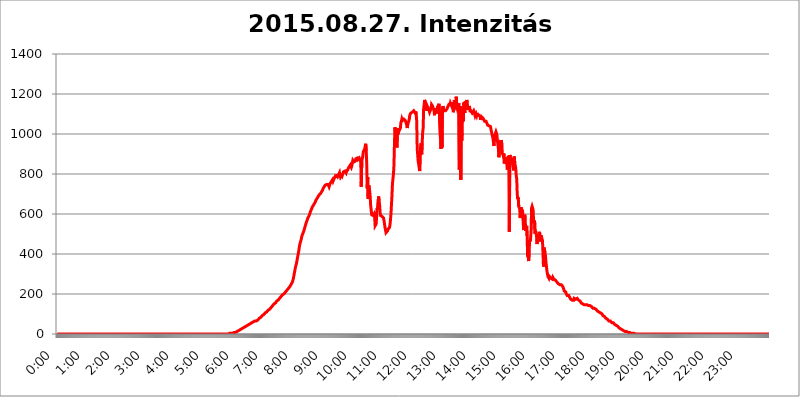
| Category | 2015.08.27. Intenzitás [W/m^2] |
|---|---|
| 0.0 | 0 |
| 0.0006944444444444445 | 0 |
| 0.001388888888888889 | 0 |
| 0.0020833333333333333 | 0 |
| 0.002777777777777778 | 0 |
| 0.003472222222222222 | 0 |
| 0.004166666666666667 | 0 |
| 0.004861111111111111 | 0 |
| 0.005555555555555556 | 0 |
| 0.0062499999999999995 | 0 |
| 0.006944444444444444 | 0 |
| 0.007638888888888889 | 0 |
| 0.008333333333333333 | 0 |
| 0.009027777777777779 | 0 |
| 0.009722222222222222 | 0 |
| 0.010416666666666666 | 0 |
| 0.011111111111111112 | 0 |
| 0.011805555555555555 | 0 |
| 0.012499999999999999 | 0 |
| 0.013194444444444444 | 0 |
| 0.013888888888888888 | 0 |
| 0.014583333333333332 | 0 |
| 0.015277777777777777 | 0 |
| 0.015972222222222224 | 0 |
| 0.016666666666666666 | 0 |
| 0.017361111111111112 | 0 |
| 0.018055555555555557 | 0 |
| 0.01875 | 0 |
| 0.019444444444444445 | 0 |
| 0.02013888888888889 | 0 |
| 0.020833333333333332 | 0 |
| 0.02152777777777778 | 0 |
| 0.022222222222222223 | 0 |
| 0.02291666666666667 | 0 |
| 0.02361111111111111 | 0 |
| 0.024305555555555556 | 0 |
| 0.024999999999999998 | 0 |
| 0.025694444444444447 | 0 |
| 0.02638888888888889 | 0 |
| 0.027083333333333334 | 0 |
| 0.027777777777777776 | 0 |
| 0.02847222222222222 | 0 |
| 0.029166666666666664 | 0 |
| 0.029861111111111113 | 0 |
| 0.030555555555555555 | 0 |
| 0.03125 | 0 |
| 0.03194444444444445 | 0 |
| 0.03263888888888889 | 0 |
| 0.03333333333333333 | 0 |
| 0.034027777777777775 | 0 |
| 0.034722222222222224 | 0 |
| 0.035416666666666666 | 0 |
| 0.036111111111111115 | 0 |
| 0.03680555555555556 | 0 |
| 0.0375 | 0 |
| 0.03819444444444444 | 0 |
| 0.03888888888888889 | 0 |
| 0.03958333333333333 | 0 |
| 0.04027777777777778 | 0 |
| 0.04097222222222222 | 0 |
| 0.041666666666666664 | 0 |
| 0.042361111111111106 | 0 |
| 0.04305555555555556 | 0 |
| 0.043750000000000004 | 0 |
| 0.044444444444444446 | 0 |
| 0.04513888888888889 | 0 |
| 0.04583333333333334 | 0 |
| 0.04652777777777778 | 0 |
| 0.04722222222222222 | 0 |
| 0.04791666666666666 | 0 |
| 0.04861111111111111 | 0 |
| 0.049305555555555554 | 0 |
| 0.049999999999999996 | 0 |
| 0.05069444444444445 | 0 |
| 0.051388888888888894 | 0 |
| 0.052083333333333336 | 0 |
| 0.05277777777777778 | 0 |
| 0.05347222222222222 | 0 |
| 0.05416666666666667 | 0 |
| 0.05486111111111111 | 0 |
| 0.05555555555555555 | 0 |
| 0.05625 | 0 |
| 0.05694444444444444 | 0 |
| 0.057638888888888885 | 0 |
| 0.05833333333333333 | 0 |
| 0.05902777777777778 | 0 |
| 0.059722222222222225 | 0 |
| 0.06041666666666667 | 0 |
| 0.061111111111111116 | 0 |
| 0.06180555555555556 | 0 |
| 0.0625 | 0 |
| 0.06319444444444444 | 0 |
| 0.06388888888888888 | 0 |
| 0.06458333333333334 | 0 |
| 0.06527777777777778 | 0 |
| 0.06597222222222222 | 0 |
| 0.06666666666666667 | 0 |
| 0.06736111111111111 | 0 |
| 0.06805555555555555 | 0 |
| 0.06874999999999999 | 0 |
| 0.06944444444444443 | 0 |
| 0.07013888888888889 | 0 |
| 0.07083333333333333 | 0 |
| 0.07152777777777779 | 0 |
| 0.07222222222222223 | 0 |
| 0.07291666666666667 | 0 |
| 0.07361111111111111 | 0 |
| 0.07430555555555556 | 0 |
| 0.075 | 0 |
| 0.07569444444444444 | 0 |
| 0.0763888888888889 | 0 |
| 0.07708333333333334 | 0 |
| 0.07777777777777778 | 0 |
| 0.07847222222222222 | 0 |
| 0.07916666666666666 | 0 |
| 0.0798611111111111 | 0 |
| 0.08055555555555556 | 0 |
| 0.08125 | 0 |
| 0.08194444444444444 | 0 |
| 0.08263888888888889 | 0 |
| 0.08333333333333333 | 0 |
| 0.08402777777777777 | 0 |
| 0.08472222222222221 | 0 |
| 0.08541666666666665 | 0 |
| 0.08611111111111112 | 0 |
| 0.08680555555555557 | 0 |
| 0.08750000000000001 | 0 |
| 0.08819444444444445 | 0 |
| 0.08888888888888889 | 0 |
| 0.08958333333333333 | 0 |
| 0.09027777777777778 | 0 |
| 0.09097222222222222 | 0 |
| 0.09166666666666667 | 0 |
| 0.09236111111111112 | 0 |
| 0.09305555555555556 | 0 |
| 0.09375 | 0 |
| 0.09444444444444444 | 0 |
| 0.09513888888888888 | 0 |
| 0.09583333333333333 | 0 |
| 0.09652777777777777 | 0 |
| 0.09722222222222222 | 0 |
| 0.09791666666666667 | 0 |
| 0.09861111111111111 | 0 |
| 0.09930555555555555 | 0 |
| 0.09999999999999999 | 0 |
| 0.10069444444444443 | 0 |
| 0.1013888888888889 | 0 |
| 0.10208333333333335 | 0 |
| 0.10277777777777779 | 0 |
| 0.10347222222222223 | 0 |
| 0.10416666666666667 | 0 |
| 0.10486111111111111 | 0 |
| 0.10555555555555556 | 0 |
| 0.10625 | 0 |
| 0.10694444444444444 | 0 |
| 0.1076388888888889 | 0 |
| 0.10833333333333334 | 0 |
| 0.10902777777777778 | 0 |
| 0.10972222222222222 | 0 |
| 0.1111111111111111 | 0 |
| 0.11180555555555556 | 0 |
| 0.11180555555555556 | 0 |
| 0.1125 | 0 |
| 0.11319444444444444 | 0 |
| 0.11388888888888889 | 0 |
| 0.11458333333333333 | 0 |
| 0.11527777777777777 | 0 |
| 0.11597222222222221 | 0 |
| 0.11666666666666665 | 0 |
| 0.1173611111111111 | 0 |
| 0.11805555555555557 | 0 |
| 0.11944444444444445 | 0 |
| 0.12013888888888889 | 0 |
| 0.12083333333333333 | 0 |
| 0.12152777777777778 | 0 |
| 0.12222222222222223 | 0 |
| 0.12291666666666667 | 0 |
| 0.12291666666666667 | 0 |
| 0.12361111111111112 | 0 |
| 0.12430555555555556 | 0 |
| 0.125 | 0 |
| 0.12569444444444444 | 0 |
| 0.12638888888888888 | 0 |
| 0.12708333333333333 | 0 |
| 0.16875 | 0 |
| 0.12847222222222224 | 0 |
| 0.12916666666666668 | 0 |
| 0.12986111111111112 | 0 |
| 0.13055555555555556 | 0 |
| 0.13125 | 0 |
| 0.13194444444444445 | 0 |
| 0.1326388888888889 | 0 |
| 0.13333333333333333 | 0 |
| 0.13402777777777777 | 0 |
| 0.13402777777777777 | 0 |
| 0.13472222222222222 | 0 |
| 0.13541666666666666 | 0 |
| 0.1361111111111111 | 0 |
| 0.13749999999999998 | 0 |
| 0.13819444444444443 | 0 |
| 0.1388888888888889 | 0 |
| 0.13958333333333334 | 0 |
| 0.14027777777777778 | 0 |
| 0.14097222222222222 | 0 |
| 0.14166666666666666 | 0 |
| 0.1423611111111111 | 0 |
| 0.14305555555555557 | 0 |
| 0.14375000000000002 | 0 |
| 0.14444444444444446 | 0 |
| 0.1451388888888889 | 0 |
| 0.1451388888888889 | 0 |
| 0.14652777777777778 | 0 |
| 0.14722222222222223 | 0 |
| 0.14791666666666667 | 0 |
| 0.1486111111111111 | 0 |
| 0.14930555555555555 | 0 |
| 0.15 | 0 |
| 0.15069444444444444 | 0 |
| 0.15138888888888888 | 0 |
| 0.15208333333333332 | 0 |
| 0.15277777777777776 | 0 |
| 0.15347222222222223 | 0 |
| 0.15416666666666667 | 0 |
| 0.15486111111111112 | 0 |
| 0.15555555555555556 | 0 |
| 0.15625 | 0 |
| 0.15694444444444444 | 0 |
| 0.15763888888888888 | 0 |
| 0.15833333333333333 | 0 |
| 0.15902777777777777 | 0 |
| 0.15972222222222224 | 0 |
| 0.16041666666666668 | 0 |
| 0.16111111111111112 | 0 |
| 0.16180555555555556 | 0 |
| 0.1625 | 0 |
| 0.16319444444444445 | 0 |
| 0.1638888888888889 | 0 |
| 0.16458333333333333 | 0 |
| 0.16527777777777777 | 0 |
| 0.16597222222222222 | 0 |
| 0.16666666666666666 | 0 |
| 0.1673611111111111 | 0 |
| 0.16805555555555554 | 0 |
| 0.16874999999999998 | 0 |
| 0.16944444444444443 | 0 |
| 0.17013888888888887 | 0 |
| 0.1708333333333333 | 0 |
| 0.17152777777777775 | 0 |
| 0.17222222222222225 | 0 |
| 0.1729166666666667 | 0 |
| 0.17361111111111113 | 0 |
| 0.17430555555555557 | 0 |
| 0.17500000000000002 | 0 |
| 0.17569444444444446 | 0 |
| 0.1763888888888889 | 0 |
| 0.17708333333333334 | 0 |
| 0.17777777777777778 | 0 |
| 0.17847222222222223 | 0 |
| 0.17916666666666667 | 0 |
| 0.1798611111111111 | 0 |
| 0.18055555555555555 | 0 |
| 0.18125 | 0 |
| 0.18194444444444444 | 0 |
| 0.1826388888888889 | 0 |
| 0.18333333333333335 | 0 |
| 0.1840277777777778 | 0 |
| 0.18472222222222223 | 0 |
| 0.18541666666666667 | 0 |
| 0.18611111111111112 | 0 |
| 0.18680555555555556 | 0 |
| 0.1875 | 0 |
| 0.18819444444444444 | 0 |
| 0.18888888888888888 | 0 |
| 0.18958333333333333 | 0 |
| 0.19027777777777777 | 0 |
| 0.1909722222222222 | 0 |
| 0.19166666666666665 | 0 |
| 0.19236111111111112 | 0 |
| 0.19305555555555554 | 0 |
| 0.19375 | 0 |
| 0.19444444444444445 | 0 |
| 0.1951388888888889 | 0 |
| 0.19583333333333333 | 0 |
| 0.19652777777777777 | 0 |
| 0.19722222222222222 | 0 |
| 0.19791666666666666 | 0 |
| 0.1986111111111111 | 0 |
| 0.19930555555555554 | 0 |
| 0.19999999999999998 | 0 |
| 0.20069444444444443 | 0 |
| 0.20138888888888887 | 0 |
| 0.2020833333333333 | 0 |
| 0.2027777777777778 | 0 |
| 0.2034722222222222 | 0 |
| 0.2041666666666667 | 0 |
| 0.20486111111111113 | 0 |
| 0.20555555555555557 | 0 |
| 0.20625000000000002 | 0 |
| 0.20694444444444446 | 0 |
| 0.2076388888888889 | 0 |
| 0.20833333333333334 | 0 |
| 0.20902777777777778 | 0 |
| 0.20972222222222223 | 0 |
| 0.21041666666666667 | 0 |
| 0.2111111111111111 | 0 |
| 0.21180555555555555 | 0 |
| 0.2125 | 0 |
| 0.21319444444444444 | 0 |
| 0.2138888888888889 | 0 |
| 0.21458333333333335 | 0 |
| 0.2152777777777778 | 0 |
| 0.21597222222222223 | 0 |
| 0.21666666666666667 | 0 |
| 0.21736111111111112 | 0 |
| 0.21805555555555556 | 0 |
| 0.21875 | 0 |
| 0.21944444444444444 | 0 |
| 0.22013888888888888 | 0 |
| 0.22083333333333333 | 0 |
| 0.22152777777777777 | 0 |
| 0.2222222222222222 | 0 |
| 0.22291666666666665 | 0 |
| 0.2236111111111111 | 0 |
| 0.22430555555555556 | 0 |
| 0.225 | 0 |
| 0.22569444444444445 | 0 |
| 0.2263888888888889 | 0 |
| 0.22708333333333333 | 0 |
| 0.22777777777777777 | 0 |
| 0.22847222222222222 | 0 |
| 0.22916666666666666 | 0 |
| 0.2298611111111111 | 0 |
| 0.23055555555555554 | 0 |
| 0.23124999999999998 | 0 |
| 0.23194444444444443 | 0 |
| 0.23263888888888887 | 0 |
| 0.2333333333333333 | 0 |
| 0.2340277777777778 | 0 |
| 0.2347222222222222 | 0 |
| 0.2354166666666667 | 0 |
| 0.23611111111111113 | 0 |
| 0.23680555555555557 | 0 |
| 0.23750000000000002 | 0 |
| 0.23819444444444446 | 0 |
| 0.2388888888888889 | 0 |
| 0.23958333333333334 | 0 |
| 0.24027777777777778 | 0 |
| 0.24097222222222223 | 3.525 |
| 0.24166666666666667 | 3.525 |
| 0.2423611111111111 | 3.525 |
| 0.24305555555555555 | 3.525 |
| 0.24375 | 3.525 |
| 0.24444444444444446 | 3.525 |
| 0.24513888888888888 | 3.525 |
| 0.24583333333333335 | 3.525 |
| 0.2465277777777778 | 3.525 |
| 0.24722222222222223 | 7.887 |
| 0.24791666666666667 | 7.887 |
| 0.24861111111111112 | 7.887 |
| 0.24930555555555556 | 7.887 |
| 0.25 | 7.887 |
| 0.25069444444444444 | 12.257 |
| 0.2513888888888889 | 12.257 |
| 0.2520833333333333 | 12.257 |
| 0.25277777777777777 | 16.636 |
| 0.2534722222222222 | 16.636 |
| 0.25416666666666665 | 16.636 |
| 0.2548611111111111 | 21.024 |
| 0.2555555555555556 | 21.024 |
| 0.25625000000000003 | 21.024 |
| 0.2569444444444445 | 25.419 |
| 0.2576388888888889 | 25.419 |
| 0.25833333333333336 | 25.419 |
| 0.2590277777777778 | 29.823 |
| 0.25972222222222224 | 29.823 |
| 0.2604166666666667 | 29.823 |
| 0.2611111111111111 | 29.823 |
| 0.26180555555555557 | 34.234 |
| 0.2625 | 34.234 |
| 0.26319444444444445 | 38.653 |
| 0.2638888888888889 | 38.653 |
| 0.26458333333333334 | 38.653 |
| 0.2652777777777778 | 38.653 |
| 0.2659722222222222 | 43.079 |
| 0.26666666666666666 | 43.079 |
| 0.2673611111111111 | 47.511 |
| 0.26805555555555555 | 47.511 |
| 0.26875 | 47.511 |
| 0.26944444444444443 | 47.511 |
| 0.2701388888888889 | 51.951 |
| 0.2708333333333333 | 51.951 |
| 0.27152777777777776 | 51.951 |
| 0.2722222222222222 | 56.398 |
| 0.27291666666666664 | 56.398 |
| 0.2736111111111111 | 56.398 |
| 0.2743055555555555 | 56.398 |
| 0.27499999999999997 | 60.85 |
| 0.27569444444444446 | 60.85 |
| 0.27638888888888885 | 60.85 |
| 0.27708333333333335 | 65.31 |
| 0.2777777777777778 | 65.31 |
| 0.27847222222222223 | 65.31 |
| 0.2791666666666667 | 65.31 |
| 0.2798611111111111 | 69.775 |
| 0.28055555555555556 | 69.775 |
| 0.28125 | 69.775 |
| 0.28194444444444444 | 74.246 |
| 0.2826388888888889 | 74.246 |
| 0.2833333333333333 | 78.722 |
| 0.28402777777777777 | 78.722 |
| 0.2847222222222222 | 83.205 |
| 0.28541666666666665 | 83.205 |
| 0.28611111111111115 | 87.692 |
| 0.28680555555555554 | 87.692 |
| 0.28750000000000003 | 92.184 |
| 0.2881944444444445 | 92.184 |
| 0.2888888888888889 | 96.682 |
| 0.28958333333333336 | 96.682 |
| 0.2902777777777778 | 101.184 |
| 0.29097222222222224 | 101.184 |
| 0.2916666666666667 | 105.69 |
| 0.2923611111111111 | 105.69 |
| 0.29305555555555557 | 105.69 |
| 0.29375 | 110.201 |
| 0.29444444444444445 | 110.201 |
| 0.2951388888888889 | 114.716 |
| 0.29583333333333334 | 119.235 |
| 0.2965277777777778 | 119.235 |
| 0.2972222222222222 | 123.758 |
| 0.29791666666666666 | 123.758 |
| 0.2986111111111111 | 128.284 |
| 0.29930555555555555 | 128.284 |
| 0.3 | 132.814 |
| 0.30069444444444443 | 137.347 |
| 0.3013888888888889 | 137.347 |
| 0.3020833333333333 | 141.884 |
| 0.30277777777777776 | 141.884 |
| 0.3034722222222222 | 146.423 |
| 0.30416666666666664 | 150.964 |
| 0.3048611111111111 | 150.964 |
| 0.3055555555555555 | 155.509 |
| 0.30624999999999997 | 155.509 |
| 0.3069444444444444 | 160.056 |
| 0.3076388888888889 | 164.605 |
| 0.30833333333333335 | 164.605 |
| 0.3090277777777778 | 164.605 |
| 0.30972222222222223 | 169.156 |
| 0.3104166666666667 | 173.709 |
| 0.3111111111111111 | 173.709 |
| 0.31180555555555556 | 178.264 |
| 0.3125 | 182.82 |
| 0.31319444444444444 | 182.82 |
| 0.3138888888888889 | 187.378 |
| 0.3145833333333333 | 191.937 |
| 0.31527777777777777 | 191.937 |
| 0.3159722222222222 | 196.497 |
| 0.31666666666666665 | 196.497 |
| 0.31736111111111115 | 201.058 |
| 0.31805555555555554 | 201.058 |
| 0.31875000000000003 | 205.62 |
| 0.3194444444444445 | 205.62 |
| 0.3201388888888889 | 210.182 |
| 0.32083333333333336 | 214.746 |
| 0.3215277777777778 | 214.746 |
| 0.32222222222222224 | 219.309 |
| 0.3229166666666667 | 219.309 |
| 0.3236111111111111 | 223.873 |
| 0.32430555555555557 | 228.436 |
| 0.325 | 233 |
| 0.32569444444444445 | 233 |
| 0.3263888888888889 | 237.564 |
| 0.32708333333333334 | 242.127 |
| 0.3277777777777778 | 246.689 |
| 0.3284722222222222 | 251.251 |
| 0.32916666666666666 | 251.251 |
| 0.3298611111111111 | 260.373 |
| 0.33055555555555555 | 264.932 |
| 0.33125 | 278.603 |
| 0.33194444444444443 | 292.259 |
| 0.3326388888888889 | 305.898 |
| 0.3333333333333333 | 319.517 |
| 0.3340277777777778 | 333.113 |
| 0.3347222222222222 | 342.162 |
| 0.3354166666666667 | 351.198 |
| 0.3361111111111111 | 364.728 |
| 0.3368055555555556 | 378.224 |
| 0.33749999999999997 | 391.685 |
| 0.33819444444444446 | 405.108 |
| 0.33888888888888885 | 418.492 |
| 0.33958333333333335 | 436.27 |
| 0.34027777777777773 | 449.551 |
| 0.34097222222222223 | 458.38 |
| 0.3416666666666666 | 467.187 |
| 0.3423611111111111 | 475.972 |
| 0.3430555555555555 | 489.108 |
| 0.34375 | 493.475 |
| 0.3444444444444445 | 502.192 |
| 0.3451388888888889 | 506.542 |
| 0.3458333333333334 | 515.223 |
| 0.34652777777777777 | 523.88 |
| 0.34722222222222227 | 532.513 |
| 0.34791666666666665 | 541.121 |
| 0.34861111111111115 | 549.704 |
| 0.34930555555555554 | 558.261 |
| 0.35000000000000003 | 562.53 |
| 0.3506944444444444 | 571.049 |
| 0.3513888888888889 | 579.542 |
| 0.3520833333333333 | 583.779 |
| 0.3527777777777778 | 588.009 |
| 0.3534722222222222 | 592.233 |
| 0.3541666666666667 | 600.661 |
| 0.3548611111111111 | 609.062 |
| 0.35555555555555557 | 613.252 |
| 0.35625 | 621.613 |
| 0.35694444444444445 | 625.784 |
| 0.3576388888888889 | 634.105 |
| 0.35833333333333334 | 638.256 |
| 0.3590277777777778 | 642.4 |
| 0.3597222222222222 | 642.4 |
| 0.36041666666666666 | 650.667 |
| 0.3611111111111111 | 654.791 |
| 0.36180555555555555 | 658.909 |
| 0.3625 | 667.123 |
| 0.36319444444444443 | 671.22 |
| 0.3638888888888889 | 675.311 |
| 0.3645833333333333 | 679.395 |
| 0.3652777777777778 | 679.395 |
| 0.3659722222222222 | 687.544 |
| 0.3666666666666667 | 691.608 |
| 0.3673611111111111 | 695.666 |
| 0.3680555555555556 | 695.666 |
| 0.36874999999999997 | 699.717 |
| 0.36944444444444446 | 703.762 |
| 0.37013888888888885 | 707.8 |
| 0.37083333333333335 | 711.832 |
| 0.37152777777777773 | 715.858 |
| 0.37222222222222223 | 719.877 |
| 0.3729166666666666 | 727.896 |
| 0.3736111111111111 | 731.896 |
| 0.3743055555555555 | 735.89 |
| 0.375 | 735.89 |
| 0.3756944444444445 | 743.859 |
| 0.3763888888888889 | 743.859 |
| 0.3770833333333334 | 743.859 |
| 0.37777777777777777 | 747.834 |
| 0.37847222222222227 | 751.803 |
| 0.37916666666666665 | 747.834 |
| 0.37986111111111115 | 747.834 |
| 0.38055555555555554 | 743.859 |
| 0.38125000000000003 | 735.89 |
| 0.3819444444444444 | 743.859 |
| 0.3826388888888889 | 751.803 |
| 0.3833333333333333 | 755.766 |
| 0.3840277777777778 | 755.766 |
| 0.3847222222222222 | 763.674 |
| 0.3854166666666667 | 763.674 |
| 0.3861111111111111 | 771.559 |
| 0.38680555555555557 | 763.674 |
| 0.3875 | 767.62 |
| 0.38819444444444445 | 775.492 |
| 0.3888888888888889 | 771.559 |
| 0.38958333333333334 | 779.42 |
| 0.3902777777777778 | 791.169 |
| 0.3909722222222222 | 791.169 |
| 0.39166666666666666 | 787.258 |
| 0.3923611111111111 | 787.258 |
| 0.39305555555555555 | 798.974 |
| 0.39375 | 791.169 |
| 0.39444444444444443 | 791.169 |
| 0.3951388888888889 | 795.074 |
| 0.3958333333333333 | 806.757 |
| 0.3965277777777778 | 791.169 |
| 0.3972222222222222 | 783.342 |
| 0.3979166666666667 | 783.342 |
| 0.3986111111111111 | 791.169 |
| 0.3993055555555556 | 802.868 |
| 0.39999999999999997 | 795.074 |
| 0.40069444444444446 | 802.868 |
| 0.40138888888888885 | 810.641 |
| 0.40208333333333335 | 814.519 |
| 0.40277777777777773 | 814.519 |
| 0.40347222222222223 | 814.519 |
| 0.4041666666666666 | 818.392 |
| 0.4048611111111111 | 806.757 |
| 0.4055555555555555 | 822.26 |
| 0.40625 | 814.519 |
| 0.4069444444444445 | 818.392 |
| 0.4076388888888889 | 822.26 |
| 0.4083333333333334 | 829.981 |
| 0.40902777777777777 | 829.981 |
| 0.40972222222222227 | 837.682 |
| 0.41041666666666665 | 841.526 |
| 0.41111111111111115 | 845.365 |
| 0.41180555555555554 | 841.526 |
| 0.41250000000000003 | 833.834 |
| 0.4131944444444444 | 841.526 |
| 0.4138888888888889 | 841.526 |
| 0.4145833333333333 | 868.305 |
| 0.4152777777777778 | 864.493 |
| 0.4159722222222222 | 860.676 |
| 0.4166666666666667 | 864.493 |
| 0.4173611111111111 | 864.493 |
| 0.41805555555555557 | 864.493 |
| 0.41875 | 875.918 |
| 0.41944444444444445 | 872.114 |
| 0.4201388888888889 | 872.114 |
| 0.42083333333333334 | 879.719 |
| 0.4215277777777778 | 872.114 |
| 0.4222222222222222 | 875.918 |
| 0.42291666666666666 | 872.114 |
| 0.4236111111111111 | 879.719 |
| 0.42430555555555555 | 883.516 |
| 0.425 | 883.516 |
| 0.42569444444444443 | 860.676 |
| 0.4263888888888889 | 735.89 |
| 0.4270833333333333 | 864.493 |
| 0.4277777777777778 | 868.305 |
| 0.4284722222222222 | 887.309 |
| 0.4291666666666667 | 909.996 |
| 0.4298611111111111 | 909.996 |
| 0.4305555555555556 | 909.996 |
| 0.43124999999999997 | 925.06 |
| 0.43194444444444446 | 940.082 |
| 0.43263888888888885 | 951.327 |
| 0.43333333333333335 | 917.534 |
| 0.43402777777777773 | 856.855 |
| 0.43472222222222223 | 727.896 |
| 0.4354166666666666 | 783.342 |
| 0.4361111111111111 | 675.311 |
| 0.4368055555555555 | 743.859 |
| 0.4375 | 747.834 |
| 0.4381944444444445 | 715.858 |
| 0.4388888888888889 | 687.544 |
| 0.4395833333333334 | 642.4 |
| 0.44027777777777777 | 621.613 |
| 0.44097222222222227 | 596.45 |
| 0.44166666666666665 | 592.233 |
| 0.44236111111111115 | 596.45 |
| 0.44305555555555554 | 592.233 |
| 0.44375000000000003 | 592.233 |
| 0.4444444444444444 | 600.661 |
| 0.4451388888888889 | 588.009 |
| 0.4458333333333333 | 541.121 |
| 0.4465277777777778 | 536.82 |
| 0.4472222222222222 | 549.704 |
| 0.4479166666666667 | 583.779 |
| 0.4486111111111111 | 629.948 |
| 0.44930555555555557 | 621.613 |
| 0.45 | 625.784 |
| 0.45069444444444445 | 687.544 |
| 0.4513888888888889 | 667.123 |
| 0.45208333333333334 | 646.537 |
| 0.4527777777777778 | 609.062 |
| 0.4534722222222222 | 592.233 |
| 0.45416666666666666 | 596.45 |
| 0.4548611111111111 | 592.233 |
| 0.45555555555555555 | 588.009 |
| 0.45625 | 583.779 |
| 0.45694444444444443 | 588.009 |
| 0.4576388888888889 | 579.542 |
| 0.4583333333333333 | 566.793 |
| 0.4590277777777778 | 549.704 |
| 0.4597222222222222 | 532.513 |
| 0.4604166666666667 | 519.555 |
| 0.4611111111111111 | 506.542 |
| 0.4618055555555556 | 502.192 |
| 0.46249999999999997 | 506.542 |
| 0.46319444444444446 | 515.223 |
| 0.46388888888888885 | 523.88 |
| 0.46458333333333335 | 523.88 |
| 0.46527777777777773 | 523.88 |
| 0.46597222222222223 | 532.513 |
| 0.4666666666666666 | 545.416 |
| 0.4673611111111111 | 571.049 |
| 0.4680555555555555 | 600.661 |
| 0.46875 | 646.537 |
| 0.4694444444444445 | 691.608 |
| 0.4701388888888889 | 751.803 |
| 0.4708333333333334 | 775.492 |
| 0.47152777777777777 | 798.974 |
| 0.47222222222222227 | 841.526 |
| 0.47291666666666665 | 947.58 |
| 0.47361111111111115 | 1033.537 |
| 0.47430555555555554 | 1014.852 |
| 0.47500000000000003 | 1022.323 |
| 0.4756944444444444 | 955.071 |
| 0.4763888888888889 | 932.576 |
| 0.4770833333333333 | 1003.65 |
| 0.4777777777777778 | 996.182 |
| 0.4784722222222222 | 1029.798 |
| 0.4791666666666667 | 1033.537 |
| 0.4798611111111111 | 1018.587 |
| 0.48055555555555557 | 1022.323 |
| 0.48125 | 1029.798 |
| 0.48194444444444445 | 1056.004 |
| 0.4826388888888889 | 1063.51 |
| 0.48333333333333334 | 1074.789 |
| 0.4840277777777778 | 1067.267 |
| 0.4847222222222222 | 1067.267 |
| 0.48541666666666666 | 1067.267 |
| 0.4861111111111111 | 1074.789 |
| 0.48680555555555555 | 1078.555 |
| 0.4875 | 1078.555 |
| 0.48819444444444443 | 1067.267 |
| 0.4888888888888889 | 1063.51 |
| 0.4895833333333333 | 1052.255 |
| 0.4902777777777778 | 1041.019 |
| 0.4909722222222222 | 1029.798 |
| 0.4916666666666667 | 1052.255 |
| 0.4923611111111111 | 1052.255 |
| 0.4930555555555556 | 1063.51 |
| 0.49374999999999997 | 1074.789 |
| 0.49444444444444446 | 1093.653 |
| 0.49513888888888885 | 1097.437 |
| 0.49583333333333335 | 1105.019 |
| 0.49652777777777773 | 1108.816 |
| 0.49722222222222223 | 1108.816 |
| 0.4979166666666666 | 1108.816 |
| 0.4986111111111111 | 1105.019 |
| 0.4993055555555555 | 1108.816 |
| 0.5 | 1116.426 |
| 0.5006944444444444 | 1120.238 |
| 0.5013888888888889 | 1112.618 |
| 0.5020833333333333 | 1105.019 |
| 0.5027777777777778 | 1112.618 |
| 0.5034722222222222 | 1097.437 |
| 0.5041666666666667 | 1063.51 |
| 0.5048611111111111 | 925.06 |
| 0.5055555555555555 | 894.885 |
| 0.50625 | 860.676 |
| 0.5069444444444444 | 849.199 |
| 0.5076388888888889 | 829.981 |
| 0.5083333333333333 | 814.519 |
| 0.5090277777777777 | 902.447 |
| 0.5097222222222222 | 940.082 |
| 0.5104166666666666 | 955.071 |
| 0.5111111111111112 | 898.668 |
| 0.5118055555555555 | 951.327 |
| 0.5125000000000001 | 1007.383 |
| 0.5131944444444444 | 1029.798 |
| 0.513888888888889 | 1127.879 |
| 0.5145833333333333 | 1147.086 |
| 0.5152777777777778 | 1170.358 |
| 0.5159722222222222 | 1166.46 |
| 0.5166666666666667 | 1154.814 |
| 0.517361111111111 | 1143.232 |
| 0.5180555555555556 | 1116.426 |
| 0.5187499999999999 | 1112.618 |
| 0.5194444444444445 | 1135.543 |
| 0.5201388888888888 | 1131.708 |
| 0.5208333333333334 | 1124.056 |
| 0.5215277777777778 | 1124.056 |
| 0.5222222222222223 | 1108.816 |
| 0.5229166666666667 | 1108.816 |
| 0.5236111111111111 | 1108.816 |
| 0.5243055555555556 | 1127.879 |
| 0.525 | 1147.086 |
| 0.5256944444444445 | 1143.232 |
| 0.5263888888888889 | 1139.384 |
| 0.5270833333333333 | 1139.384 |
| 0.5277777777777778 | 1135.543 |
| 0.5284722222222222 | 1116.426 |
| 0.5291666666666667 | 1093.653 |
| 0.5298611111111111 | 1127.879 |
| 0.5305555555555556 | 1112.618 |
| 0.53125 | 1101.226 |
| 0.5319444444444444 | 1101.226 |
| 0.5326388888888889 | 1124.056 |
| 0.5333333333333333 | 1135.543 |
| 0.5340277777777778 | 1135.543 |
| 0.5347222222222222 | 1143.232 |
| 0.5354166666666667 | 1150.946 |
| 0.5361111111111111 | 1150.946 |
| 0.5368055555555555 | 1154.814 |
| 0.5375 | 977.508 |
| 0.5381944444444444 | 925.06 |
| 0.5388888888888889 | 1044.762 |
| 0.5395833333333333 | 932.576 |
| 0.5402777777777777 | 1127.879 |
| 0.5409722222222222 | 1139.384 |
| 0.5416666666666666 | 1139.384 |
| 0.5423611111111112 | 1116.426 |
| 0.5430555555555555 | 1116.426 |
| 0.5437500000000001 | 1112.618 |
| 0.5444444444444444 | 1116.426 |
| 0.545138888888889 | 1116.426 |
| 0.5458333333333333 | 1112.618 |
| 0.5465277777777778 | 1124.056 |
| 0.5472222222222222 | 1131.708 |
| 0.5479166666666667 | 1135.543 |
| 0.548611111111111 | 1135.543 |
| 0.5493055555555556 | 1147.086 |
| 0.5499999999999999 | 1154.814 |
| 0.5506944444444445 | 1143.232 |
| 0.5513888888888888 | 1154.814 |
| 0.5520833333333334 | 1154.814 |
| 0.5527777777777778 | 1143.232 |
| 0.5534722222222223 | 1143.232 |
| 0.5541666666666667 | 1158.689 |
| 0.5548611111111111 | 1127.879 |
| 0.5555555555555556 | 1108.816 |
| 0.55625 | 1124.056 |
| 0.5569444444444445 | 1170.358 |
| 0.5576388888888889 | 1124.056 |
| 0.5583333333333333 | 1162.571 |
| 0.5590277777777778 | 1147.086 |
| 0.5597222222222222 | 1186.03 |
| 0.5604166666666667 | 1139.384 |
| 0.5611111111111111 | 1127.879 |
| 0.5618055555555556 | 1135.543 |
| 0.5625 | 1147.086 |
| 0.5631944444444444 | 1154.814 |
| 0.5638888888888889 | 822.26 |
| 0.5645833333333333 | 849.199 |
| 0.5652777777777778 | 1139.384 |
| 0.5659722222222222 | 771.559 |
| 0.5666666666666667 | 1086.097 |
| 0.5673611111111111 | 966.295 |
| 0.5680555555555555 | 1093.653 |
| 0.56875 | 1112.618 |
| 0.5694444444444444 | 1063.51 |
| 0.5701388888888889 | 1150.946 |
| 0.5708333333333333 | 1158.689 |
| 0.5715277777777777 | 1105.019 |
| 0.5722222222222222 | 1162.571 |
| 0.5729166666666666 | 1158.689 |
| 0.5736111111111112 | 1120.238 |
| 0.5743055555555555 | 1170.358 |
| 0.5750000000000001 | 1147.086 |
| 0.5756944444444444 | 1139.384 |
| 0.576388888888889 | 1139.384 |
| 0.5770833333333333 | 1120.238 |
| 0.5777777777777778 | 1139.384 |
| 0.5784722222222222 | 1131.708 |
| 0.5791666666666667 | 1108.816 |
| 0.579861111111111 | 1116.426 |
| 0.5805555555555556 | 1116.426 |
| 0.5812499999999999 | 1112.618 |
| 0.5819444444444445 | 1105.019 |
| 0.5826388888888888 | 1105.019 |
| 0.5833333333333334 | 1108.816 |
| 0.5840277777777778 | 1116.426 |
| 0.5847222222222223 | 1108.816 |
| 0.5854166666666667 | 1105.019 |
| 0.5861111111111111 | 1089.873 |
| 0.5868055555555556 | 1089.873 |
| 0.5875 | 1101.226 |
| 0.5881944444444445 | 1093.653 |
| 0.5888888888888889 | 1105.019 |
| 0.5895833333333333 | 1093.653 |
| 0.5902777777777778 | 1089.873 |
| 0.5909722222222222 | 1093.653 |
| 0.5916666666666667 | 1093.653 |
| 0.5923611111111111 | 1093.653 |
| 0.5930555555555556 | 1086.097 |
| 0.59375 | 1071.027 |
| 0.5944444444444444 | 1078.555 |
| 0.5951388888888889 | 1086.097 |
| 0.5958333333333333 | 1089.873 |
| 0.5965277777777778 | 1086.097 |
| 0.5972222222222222 | 1078.555 |
| 0.5979166666666667 | 1074.789 |
| 0.5986111111111111 | 1074.789 |
| 0.5993055555555555 | 1063.51 |
| 0.6 | 1067.267 |
| 0.6006944444444444 | 1059.756 |
| 0.6013888888888889 | 1063.51 |
| 0.6020833333333333 | 1059.756 |
| 0.6027777777777777 | 1052.255 |
| 0.6034722222222222 | 1044.762 |
| 0.6041666666666666 | 1044.762 |
| 0.6048611111111112 | 1044.762 |
| 0.6055555555555555 | 1041.019 |
| 0.6062500000000001 | 1041.019 |
| 0.6069444444444444 | 1037.277 |
| 0.607638888888889 | 1037.277 |
| 0.6083333333333333 | 1022.323 |
| 0.6090277777777778 | 1011.118 |
| 0.6097222222222222 | 1007.383 |
| 0.6104166666666667 | 988.714 |
| 0.611111111111111 | 977.508 |
| 0.6118055555555556 | 958.814 |
| 0.6124999999999999 | 940.082 |
| 0.6131944444444445 | 999.916 |
| 0.6138888888888888 | 992.448 |
| 0.6145833333333334 | 1003.65 |
| 0.6152777777777778 | 1011.118 |
| 0.6159722222222223 | 1003.65 |
| 0.6166666666666667 | 992.448 |
| 0.6173611111111111 | 966.295 |
| 0.6180555555555556 | 962.555 |
| 0.61875 | 925.06 |
| 0.6194444444444445 | 883.516 |
| 0.6201388888888889 | 925.06 |
| 0.6208333333333333 | 947.58 |
| 0.6215277777777778 | 951.327 |
| 0.6222222222222222 | 936.33 |
| 0.6229166666666667 | 970.034 |
| 0.6236111111111111 | 940.082 |
| 0.6243055555555556 | 902.447 |
| 0.625 | 902.447 |
| 0.6256944444444444 | 891.099 |
| 0.6263888888888889 | 902.447 |
| 0.6270833333333333 | 853.029 |
| 0.6277777777777778 | 864.493 |
| 0.6284722222222222 | 872.114 |
| 0.6291666666666667 | 883.516 |
| 0.6298611111111111 | 883.516 |
| 0.6305555555555555 | 849.199 |
| 0.63125 | 822.26 |
| 0.6319444444444444 | 853.029 |
| 0.6326388888888889 | 891.099 |
| 0.6333333333333333 | 868.305 |
| 0.6340277777777777 | 510.885 |
| 0.6347222222222222 | 894.885 |
| 0.6354166666666666 | 887.309 |
| 0.6361111111111112 | 875.918 |
| 0.6368055555555555 | 864.493 |
| 0.6375000000000001 | 879.719 |
| 0.6381944444444444 | 849.199 |
| 0.638888888888889 | 856.855 |
| 0.6395833333333333 | 860.676 |
| 0.6402777777777778 | 818.392 |
| 0.6409722222222222 | 887.309 |
| 0.6416666666666667 | 856.855 |
| 0.642361111111111 | 841.526 |
| 0.6430555555555556 | 829.981 |
| 0.6437499999999999 | 791.169 |
| 0.6444444444444445 | 775.492 |
| 0.6451388888888888 | 699.717 |
| 0.6458333333333334 | 675.311 |
| 0.6465277777777778 | 683.473 |
| 0.6472222222222223 | 638.256 |
| 0.6479166666666667 | 634.105 |
| 0.6486111111111111 | 625.784 |
| 0.6493055555555556 | 579.542 |
| 0.65 | 613.252 |
| 0.6506944444444445 | 634.105 |
| 0.6513888888888889 | 613.252 |
| 0.6520833333333333 | 621.613 |
| 0.6527777777777778 | 609.062 |
| 0.6534722222222222 | 562.53 |
| 0.6541666666666667 | 519.555 |
| 0.6548611111111111 | 558.261 |
| 0.6555555555555556 | 596.45 |
| 0.65625 | 583.779 |
| 0.6569444444444444 | 515.223 |
| 0.6576388888888889 | 532.513 |
| 0.6583333333333333 | 541.121 |
| 0.6590277777777778 | 489.108 |
| 0.6597222222222222 | 387.202 |
| 0.6604166666666667 | 396.164 |
| 0.6611111111111111 | 364.728 |
| 0.6618055555555555 | 400.638 |
| 0.6625 | 471.582 |
| 0.6631944444444444 | 462.786 |
| 0.6638888888888889 | 480.356 |
| 0.6645833333333333 | 510.885 |
| 0.6652777777777777 | 629.948 |
| 0.6659722222222222 | 638.256 |
| 0.6666666666666666 | 642.4 |
| 0.6673611111111111 | 621.613 |
| 0.6680555555555556 | 566.793 |
| 0.6687500000000001 | 553.986 |
| 0.6694444444444444 | 566.793 |
| 0.6701388888888888 | 502.192 |
| 0.6708333333333334 | 515.223 |
| 0.6715277777777778 | 506.542 |
| 0.6722222222222222 | 489.108 |
| 0.6729166666666666 | 449.551 |
| 0.6736111111111112 | 489.108 |
| 0.6743055555555556 | 493.475 |
| 0.6749999999999999 | 489.108 |
| 0.6756944444444444 | 497.836 |
| 0.6763888888888889 | 510.885 |
| 0.6770833333333334 | 506.542 |
| 0.6777777777777777 | 462.786 |
| 0.6784722222222223 | 493.475 |
| 0.6791666666666667 | 484.735 |
| 0.6798611111111111 | 475.972 |
| 0.6805555555555555 | 467.187 |
| 0.68125 | 462.786 |
| 0.6819444444444445 | 337.639 |
| 0.6826388888888889 | 431.833 |
| 0.6833333333333332 | 427.39 |
| 0.6840277777777778 | 409.574 |
| 0.6847222222222222 | 391.685 |
| 0.6854166666666667 | 360.221 |
| 0.686111111111111 | 337.639 |
| 0.6868055555555556 | 314.98 |
| 0.6875 | 301.354 |
| 0.6881944444444444 | 287.709 |
| 0.688888888888889 | 287.709 |
| 0.6895833333333333 | 278.603 |
| 0.6902777777777778 | 287.709 |
| 0.6909722222222222 | 287.709 |
| 0.6916666666666668 | 283.156 |
| 0.6923611111111111 | 278.603 |
| 0.6930555555555555 | 283.156 |
| 0.69375 | 278.603 |
| 0.6944444444444445 | 274.047 |
| 0.6951388888888889 | 283.156 |
| 0.6958333333333333 | 278.603 |
| 0.6965277777777777 | 274.047 |
| 0.6972222222222223 | 269.49 |
| 0.6979166666666666 | 269.49 |
| 0.6986111111111111 | 269.49 |
| 0.6993055555555556 | 269.49 |
| 0.7000000000000001 | 264.932 |
| 0.7006944444444444 | 260.373 |
| 0.7013888888888888 | 260.373 |
| 0.7020833333333334 | 255.813 |
| 0.7027777777777778 | 251.251 |
| 0.7034722222222222 | 251.251 |
| 0.7041666666666666 | 251.251 |
| 0.7048611111111112 | 246.689 |
| 0.7055555555555556 | 246.689 |
| 0.7062499999999999 | 246.689 |
| 0.7069444444444444 | 246.689 |
| 0.7076388888888889 | 242.127 |
| 0.7083333333333334 | 242.127 |
| 0.7090277777777777 | 237.564 |
| 0.7097222222222223 | 233 |
| 0.7104166666666667 | 223.873 |
| 0.7111111111111111 | 214.746 |
| 0.7118055555555555 | 210.182 |
| 0.7125 | 210.182 |
| 0.7131944444444445 | 210.182 |
| 0.7138888888888889 | 201.058 |
| 0.7145833333333332 | 196.497 |
| 0.7152777777777778 | 191.937 |
| 0.7159722222222222 | 196.497 |
| 0.7166666666666667 | 196.497 |
| 0.717361111111111 | 191.937 |
| 0.7180555555555556 | 187.378 |
| 0.71875 | 182.82 |
| 0.7194444444444444 | 178.264 |
| 0.720138888888889 | 173.709 |
| 0.7208333333333333 | 173.709 |
| 0.7215277777777778 | 173.709 |
| 0.7222222222222222 | 169.156 |
| 0.7229166666666668 | 169.156 |
| 0.7236111111111111 | 164.605 |
| 0.7243055555555555 | 169.156 |
| 0.725 | 178.264 |
| 0.7256944444444445 | 178.264 |
| 0.7263888888888889 | 173.709 |
| 0.7270833333333333 | 173.709 |
| 0.7277777777777777 | 173.709 |
| 0.7284722222222223 | 178.264 |
| 0.7291666666666666 | 178.264 |
| 0.7298611111111111 | 173.709 |
| 0.7305555555555556 | 173.709 |
| 0.7312500000000001 | 169.156 |
| 0.7319444444444444 | 169.156 |
| 0.7326388888888888 | 164.605 |
| 0.7333333333333334 | 164.605 |
| 0.7340277777777778 | 160.056 |
| 0.7347222222222222 | 155.509 |
| 0.7354166666666666 | 150.964 |
| 0.7361111111111112 | 150.964 |
| 0.7368055555555556 | 150.964 |
| 0.7374999999999999 | 146.423 |
| 0.7381944444444444 | 146.423 |
| 0.7388888888888889 | 146.423 |
| 0.7395833333333334 | 146.423 |
| 0.7402777777777777 | 146.423 |
| 0.7409722222222223 | 146.423 |
| 0.7416666666666667 | 146.423 |
| 0.7423611111111111 | 146.423 |
| 0.7430555555555555 | 146.423 |
| 0.74375 | 141.884 |
| 0.7444444444444445 | 141.884 |
| 0.7451388888888889 | 141.884 |
| 0.7458333333333332 | 141.884 |
| 0.7465277777777778 | 141.884 |
| 0.7472222222222222 | 141.884 |
| 0.7479166666666667 | 137.347 |
| 0.748611111111111 | 137.347 |
| 0.7493055555555556 | 137.347 |
| 0.75 | 137.347 |
| 0.7506944444444444 | 132.814 |
| 0.751388888888889 | 128.284 |
| 0.7520833333333333 | 128.284 |
| 0.7527777777777778 | 128.284 |
| 0.7534722222222222 | 128.284 |
| 0.7541666666666668 | 128.284 |
| 0.7548611111111111 | 123.758 |
| 0.7555555555555555 | 123.758 |
| 0.75625 | 119.235 |
| 0.7569444444444445 | 119.235 |
| 0.7576388888888889 | 114.716 |
| 0.7583333333333333 | 114.716 |
| 0.7590277777777777 | 110.201 |
| 0.7597222222222223 | 110.201 |
| 0.7604166666666666 | 110.201 |
| 0.7611111111111111 | 105.69 |
| 0.7618055555555556 | 105.69 |
| 0.7625000000000001 | 101.184 |
| 0.7631944444444444 | 101.184 |
| 0.7638888888888888 | 101.184 |
| 0.7645833333333334 | 96.682 |
| 0.7652777777777778 | 92.184 |
| 0.7659722222222222 | 92.184 |
| 0.7666666666666666 | 87.692 |
| 0.7673611111111112 | 87.692 |
| 0.7680555555555556 | 83.205 |
| 0.7687499999999999 | 83.205 |
| 0.7694444444444444 | 78.722 |
| 0.7701388888888889 | 78.722 |
| 0.7708333333333334 | 74.246 |
| 0.7715277777777777 | 74.246 |
| 0.7722222222222223 | 69.775 |
| 0.7729166666666667 | 69.775 |
| 0.7736111111111111 | 65.31 |
| 0.7743055555555555 | 65.31 |
| 0.775 | 65.31 |
| 0.7756944444444445 | 65.31 |
| 0.7763888888888889 | 60.85 |
| 0.7770833333333332 | 60.85 |
| 0.7777777777777778 | 56.398 |
| 0.7784722222222222 | 56.398 |
| 0.7791666666666667 | 56.398 |
| 0.779861111111111 | 56.398 |
| 0.7805555555555556 | 51.951 |
| 0.78125 | 51.951 |
| 0.7819444444444444 | 47.511 |
| 0.782638888888889 | 47.511 |
| 0.7833333333333333 | 47.511 |
| 0.7840277777777778 | 43.079 |
| 0.7847222222222222 | 43.079 |
| 0.7854166666666668 | 38.653 |
| 0.7861111111111111 | 38.653 |
| 0.7868055555555555 | 34.234 |
| 0.7875 | 34.234 |
| 0.7881944444444445 | 29.823 |
| 0.7888888888888889 | 29.823 |
| 0.7895833333333333 | 29.823 |
| 0.7902777777777777 | 25.419 |
| 0.7909722222222223 | 25.419 |
| 0.7916666666666666 | 21.024 |
| 0.7923611111111111 | 21.024 |
| 0.7930555555555556 | 16.636 |
| 0.7937500000000001 | 16.636 |
| 0.7944444444444444 | 16.636 |
| 0.7951388888888888 | 16.636 |
| 0.7958333333333334 | 12.257 |
| 0.7965277777777778 | 12.257 |
| 0.7972222222222222 | 12.257 |
| 0.7979166666666666 | 12.257 |
| 0.7986111111111112 | 12.257 |
| 0.7993055555555556 | 12.257 |
| 0.7999999999999999 | 12.257 |
| 0.8006944444444444 | 7.887 |
| 0.8013888888888889 | 7.887 |
| 0.8020833333333334 | 7.887 |
| 0.8027777777777777 | 7.887 |
| 0.8034722222222223 | 7.887 |
| 0.8041666666666667 | 3.525 |
| 0.8048611111111111 | 3.525 |
| 0.8055555555555555 | 3.525 |
| 0.80625 | 3.525 |
| 0.8069444444444445 | 3.525 |
| 0.8076388888888889 | 3.525 |
| 0.8083333333333332 | 3.525 |
| 0.8090277777777778 | 3.525 |
| 0.8097222222222222 | 0 |
| 0.8104166666666667 | 0 |
| 0.811111111111111 | 0 |
| 0.8118055555555556 | 0 |
| 0.8125 | 0 |
| 0.8131944444444444 | 0 |
| 0.813888888888889 | 0 |
| 0.8145833333333333 | 0 |
| 0.8152777777777778 | 0 |
| 0.8159722222222222 | 0 |
| 0.8166666666666668 | 0 |
| 0.8173611111111111 | 0 |
| 0.8180555555555555 | 0 |
| 0.81875 | 0 |
| 0.8194444444444445 | 0 |
| 0.8201388888888889 | 0 |
| 0.8208333333333333 | 0 |
| 0.8215277777777777 | 0 |
| 0.8222222222222223 | 0 |
| 0.8229166666666666 | 0 |
| 0.8236111111111111 | 0 |
| 0.8243055555555556 | 0 |
| 0.8250000000000001 | 0 |
| 0.8256944444444444 | 0 |
| 0.8263888888888888 | 0 |
| 0.8270833333333334 | 0 |
| 0.8277777777777778 | 0 |
| 0.8284722222222222 | 0 |
| 0.8291666666666666 | 0 |
| 0.8298611111111112 | 0 |
| 0.8305555555555556 | 0 |
| 0.8312499999999999 | 0 |
| 0.8319444444444444 | 0 |
| 0.8326388888888889 | 0 |
| 0.8333333333333334 | 0 |
| 0.8340277777777777 | 0 |
| 0.8347222222222223 | 0 |
| 0.8354166666666667 | 0 |
| 0.8361111111111111 | 0 |
| 0.8368055555555555 | 0 |
| 0.8375 | 0 |
| 0.8381944444444445 | 0 |
| 0.8388888888888889 | 0 |
| 0.8395833333333332 | 0 |
| 0.8402777777777778 | 0 |
| 0.8409722222222222 | 0 |
| 0.8416666666666667 | 0 |
| 0.842361111111111 | 0 |
| 0.8430555555555556 | 0 |
| 0.84375 | 0 |
| 0.8444444444444444 | 0 |
| 0.845138888888889 | 0 |
| 0.8458333333333333 | 0 |
| 0.8465277777777778 | 0 |
| 0.8472222222222222 | 0 |
| 0.8479166666666668 | 0 |
| 0.8486111111111111 | 0 |
| 0.8493055555555555 | 0 |
| 0.85 | 0 |
| 0.8506944444444445 | 0 |
| 0.8513888888888889 | 0 |
| 0.8520833333333333 | 0 |
| 0.8527777777777777 | 0 |
| 0.8534722222222223 | 0 |
| 0.8541666666666666 | 0 |
| 0.8548611111111111 | 0 |
| 0.8555555555555556 | 0 |
| 0.8562500000000001 | 0 |
| 0.8569444444444444 | 0 |
| 0.8576388888888888 | 0 |
| 0.8583333333333334 | 0 |
| 0.8590277777777778 | 0 |
| 0.8597222222222222 | 0 |
| 0.8604166666666666 | 0 |
| 0.8611111111111112 | 0 |
| 0.8618055555555556 | 0 |
| 0.8624999999999999 | 0 |
| 0.8631944444444444 | 0 |
| 0.8638888888888889 | 0 |
| 0.8645833333333334 | 0 |
| 0.8652777777777777 | 0 |
| 0.8659722222222223 | 0 |
| 0.8666666666666667 | 0 |
| 0.8673611111111111 | 0 |
| 0.8680555555555555 | 0 |
| 0.86875 | 0 |
| 0.8694444444444445 | 0 |
| 0.8701388888888889 | 0 |
| 0.8708333333333332 | 0 |
| 0.8715277777777778 | 0 |
| 0.8722222222222222 | 0 |
| 0.8729166666666667 | 0 |
| 0.873611111111111 | 0 |
| 0.8743055555555556 | 0 |
| 0.875 | 0 |
| 0.8756944444444444 | 0 |
| 0.876388888888889 | 0 |
| 0.8770833333333333 | 0 |
| 0.8777777777777778 | 0 |
| 0.8784722222222222 | 0 |
| 0.8791666666666668 | 0 |
| 0.8798611111111111 | 0 |
| 0.8805555555555555 | 0 |
| 0.88125 | 0 |
| 0.8819444444444445 | 0 |
| 0.8826388888888889 | 0 |
| 0.8833333333333333 | 0 |
| 0.8840277777777777 | 0 |
| 0.8847222222222223 | 0 |
| 0.8854166666666666 | 0 |
| 0.8861111111111111 | 0 |
| 0.8868055555555556 | 0 |
| 0.8875000000000001 | 0 |
| 0.8881944444444444 | 0 |
| 0.8888888888888888 | 0 |
| 0.8895833333333334 | 0 |
| 0.8902777777777778 | 0 |
| 0.8909722222222222 | 0 |
| 0.8916666666666666 | 0 |
| 0.8923611111111112 | 0 |
| 0.8930555555555556 | 0 |
| 0.8937499999999999 | 0 |
| 0.8944444444444444 | 0 |
| 0.8951388888888889 | 0 |
| 0.8958333333333334 | 0 |
| 0.8965277777777777 | 0 |
| 0.8972222222222223 | 0 |
| 0.8979166666666667 | 0 |
| 0.8986111111111111 | 0 |
| 0.8993055555555555 | 0 |
| 0.9 | 0 |
| 0.9006944444444445 | 0 |
| 0.9013888888888889 | 0 |
| 0.9020833333333332 | 0 |
| 0.9027777777777778 | 0 |
| 0.9034722222222222 | 0 |
| 0.9041666666666667 | 0 |
| 0.904861111111111 | 0 |
| 0.9055555555555556 | 0 |
| 0.90625 | 0 |
| 0.9069444444444444 | 0 |
| 0.907638888888889 | 0 |
| 0.9083333333333333 | 0 |
| 0.9090277777777778 | 0 |
| 0.9097222222222222 | 0 |
| 0.9104166666666668 | 0 |
| 0.9111111111111111 | 0 |
| 0.9118055555555555 | 0 |
| 0.9125 | 0 |
| 0.9131944444444445 | 0 |
| 0.9138888888888889 | 0 |
| 0.9145833333333333 | 0 |
| 0.9152777777777777 | 0 |
| 0.9159722222222223 | 0 |
| 0.9166666666666666 | 0 |
| 0.9173611111111111 | 0 |
| 0.9180555555555556 | 0 |
| 0.9187500000000001 | 0 |
| 0.9194444444444444 | 0 |
| 0.9201388888888888 | 0 |
| 0.9208333333333334 | 0 |
| 0.9215277777777778 | 0 |
| 0.9222222222222222 | 0 |
| 0.9229166666666666 | 0 |
| 0.9236111111111112 | 0 |
| 0.9243055555555556 | 0 |
| 0.9249999999999999 | 0 |
| 0.9256944444444444 | 0 |
| 0.9263888888888889 | 0 |
| 0.9270833333333334 | 0 |
| 0.9277777777777777 | 0 |
| 0.9284722222222223 | 0 |
| 0.9291666666666667 | 0 |
| 0.9298611111111111 | 0 |
| 0.9305555555555555 | 0 |
| 0.93125 | 0 |
| 0.9319444444444445 | 0 |
| 0.9326388888888889 | 0 |
| 0.9333333333333332 | 0 |
| 0.9340277777777778 | 0 |
| 0.9347222222222222 | 0 |
| 0.9354166666666667 | 0 |
| 0.936111111111111 | 0 |
| 0.9368055555555556 | 0 |
| 0.9375 | 0 |
| 0.9381944444444444 | 0 |
| 0.938888888888889 | 0 |
| 0.9395833333333333 | 0 |
| 0.9402777777777778 | 0 |
| 0.9409722222222222 | 0 |
| 0.9416666666666668 | 0 |
| 0.9423611111111111 | 0 |
| 0.9430555555555555 | 0 |
| 0.94375 | 0 |
| 0.9444444444444445 | 0 |
| 0.9451388888888889 | 0 |
| 0.9458333333333333 | 0 |
| 0.9465277777777777 | 0 |
| 0.9472222222222223 | 0 |
| 0.9479166666666666 | 0 |
| 0.9486111111111111 | 0 |
| 0.9493055555555556 | 0 |
| 0.9500000000000001 | 0 |
| 0.9506944444444444 | 0 |
| 0.9513888888888888 | 0 |
| 0.9520833333333334 | 0 |
| 0.9527777777777778 | 0 |
| 0.9534722222222222 | 0 |
| 0.9541666666666666 | 0 |
| 0.9548611111111112 | 0 |
| 0.9555555555555556 | 0 |
| 0.9562499999999999 | 0 |
| 0.9569444444444444 | 0 |
| 0.9576388888888889 | 0 |
| 0.9583333333333334 | 0 |
| 0.9590277777777777 | 0 |
| 0.9597222222222223 | 0 |
| 0.9604166666666667 | 0 |
| 0.9611111111111111 | 0 |
| 0.9618055555555555 | 0 |
| 0.9625 | 0 |
| 0.9631944444444445 | 0 |
| 0.9638888888888889 | 0 |
| 0.9645833333333332 | 0 |
| 0.9652777777777778 | 0 |
| 0.9659722222222222 | 0 |
| 0.9666666666666667 | 0 |
| 0.967361111111111 | 0 |
| 0.9680555555555556 | 0 |
| 0.96875 | 0 |
| 0.9694444444444444 | 0 |
| 0.970138888888889 | 0 |
| 0.9708333333333333 | 0 |
| 0.9715277777777778 | 0 |
| 0.9722222222222222 | 0 |
| 0.9729166666666668 | 0 |
| 0.9736111111111111 | 0 |
| 0.9743055555555555 | 0 |
| 0.975 | 0 |
| 0.9756944444444445 | 0 |
| 0.9763888888888889 | 0 |
| 0.9770833333333333 | 0 |
| 0.9777777777777777 | 0 |
| 0.9784722222222223 | 0 |
| 0.9791666666666666 | 0 |
| 0.9798611111111111 | 0 |
| 0.9805555555555556 | 0 |
| 0.9812500000000001 | 0 |
| 0.9819444444444444 | 0 |
| 0.9826388888888888 | 0 |
| 0.9833333333333334 | 0 |
| 0.9840277777777778 | 0 |
| 0.9847222222222222 | 0 |
| 0.9854166666666666 | 0 |
| 0.9861111111111112 | 0 |
| 0.9868055555555556 | 0 |
| 0.9874999999999999 | 0 |
| 0.9881944444444444 | 0 |
| 0.9888888888888889 | 0 |
| 0.9895833333333334 | 0 |
| 0.9902777777777777 | 0 |
| 0.9909722222222223 | 0 |
| 0.9916666666666667 | 0 |
| 0.9923611111111111 | 0 |
| 0.9930555555555555 | 0 |
| 0.99375 | 0 |
| 0.9944444444444445 | 0 |
| 0.9951388888888889 | 0 |
| 0.9958333333333332 | 0 |
| 0.9965277777777778 | 0 |
| 0.9972222222222222 | 0 |
| 0.9979166666666667 | 0 |
| 0.998611111111111 | 0 |
| 0.9993055555555556 | 0 |